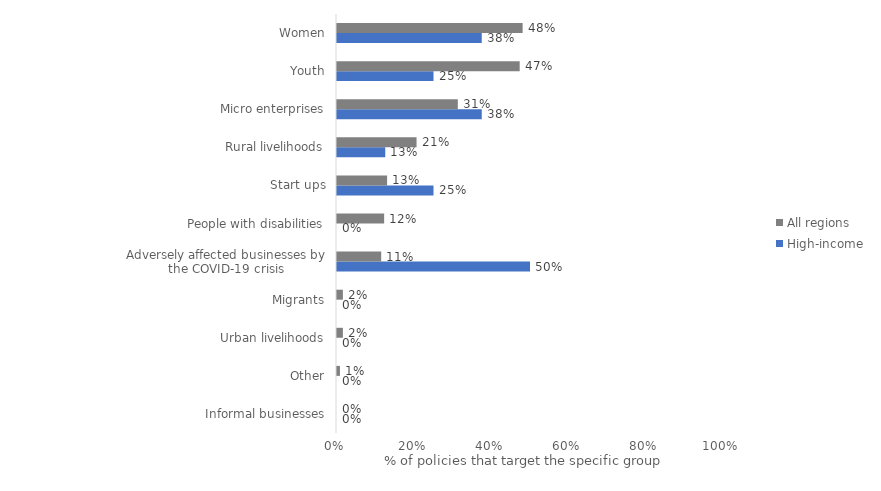
| Category | High-income | All regions |
|---|---|---|
| Informal businesses | 0 | 0 |
| Other | 0 | 0.008 |
| Urban livelihoods | 0 | 0.015 |
| Migrants | 0 | 0.015 |
| Adversely affected businesses by the COVID-19 crisis | 0.5 | 0.115 |
| People with disabilities | 0 | 0.122 |
| Start ups | 0.25 | 0.13 |
| Rural livelihoods | 0.125 | 0.206 |
| Micro enterprises | 0.375 | 0.313 |
| Youth | 0.25 | 0.473 |
| Women | 0.375 | 0.481 |